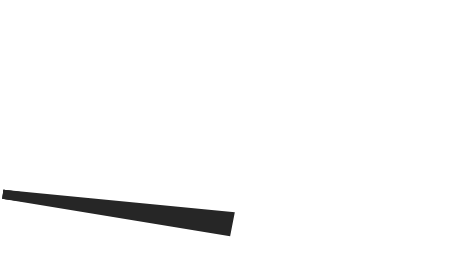
| Category | y |
|---|---|
| 0.630214018796103 | 7.914 |
| 50.31654189528749 | 1.975 |
| 49.68345810471251 | -1.975 |
| 0.630214018796103 | 7.914 |
| 50.0 | 0 |